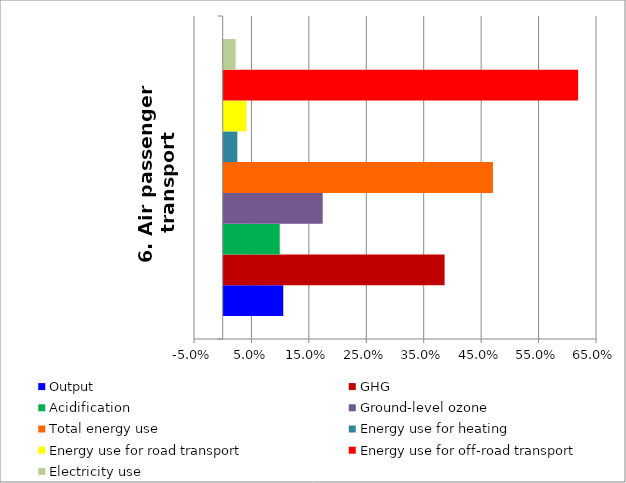
| Category | Output | GHG | Acidification | Ground-level ozone | Total energy use | Energy use for heating | Energy use for road transport | Energy use for off-road transport | Electricity use |
|---|---|---|---|---|---|---|---|---|---|
| 6. Air passenger transport   | 0.104 | 0.385 | 0.098 | 0.172 | 0.469 | 0.024 | 0.04 | 0.617 | 0.021 |